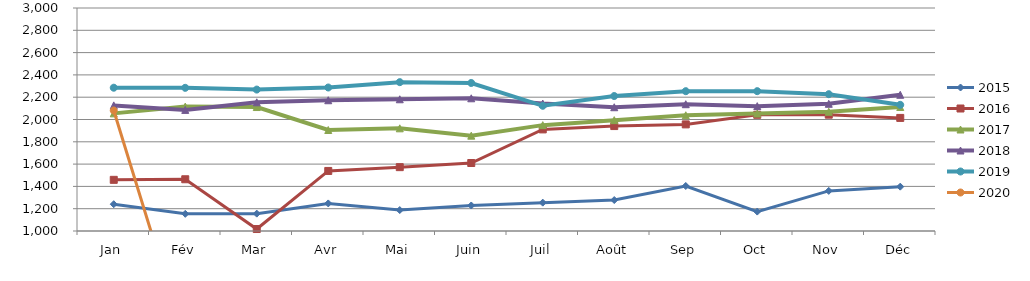
| Category | 2015 | 2016 | 2017 | 2018 | 2019 | 2020 |
|---|---|---|---|---|---|---|
| Jan | 1240.199 | 1458.845 | 2054.992 | 2126.567 | 2285.077 | 2081.175 |
| Fév | 1154.084 | 1464.053 | 2115.835 | 2086.154 | 2284.041 | 0 |
| Mar | 1155.795 | 1017.666 | 2111.775 | 2154.212 | 2268.401 | 0 |
| Avr | 1247.289 | 1538.54 | 1905.715 | 2172.757 | 2286.951 | 0 |
| Mai | 1187.813 | 1572.628 | 1920.848 | 2181.426 | 2334.869 | 0 |
| Juin | 1228.767 | 1609.855 | 1855.021 | 2190.216 | 2327.493 | 0 |
| Juil | 1254.312 | 1911.22 | 1949.439 | 2142.84 | 2123.041 | 0 |
| Août | 1277.716 | 1941.047 | 1994.139 | 2110.076 | 2210.394 | 0 |
| Sep | 1403.643 | 1956.245 | 2038.007 | 2137.072 | 2253.916 | 0 |
| Oct | 1174.168 | 2042.155 | 2053.777 | 2119.873 | 2254.192 | 0 |
| Nov | 1359.767 | 2043.123 | 2069.501 | 2140.872 | 2226.879 | 0 |
| Déc | 1397.582 | 2014.163 | 2112.138 | 2221.568 | 2131.58 | 0 |